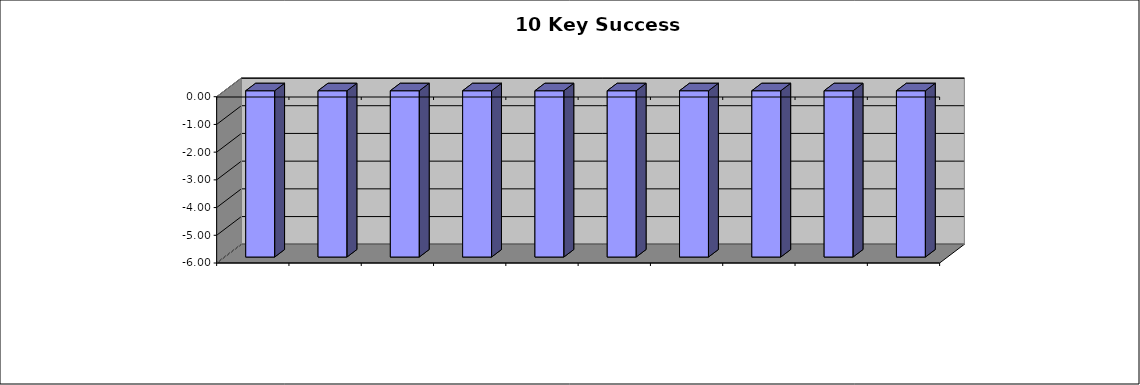
| Category | Series 0 |
|---|---|
| Stress | -6 |
| Time Management | -6 |
| Life Barriers | -6 |
| Belief Systems | -6 |
| Locus of Control | -6 |
| Life Balance | -6 |
| Energy | -6 |
| Health | -6 |
| Personal Growth | -6 |
| Family | -6 |